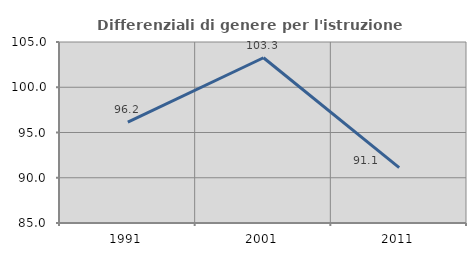
| Category | Differenziali di genere per l'istruzione superiore |
|---|---|
| 1991.0 | 96.15 |
| 2001.0 | 103.26 |
| 2011.0 | 91.125 |